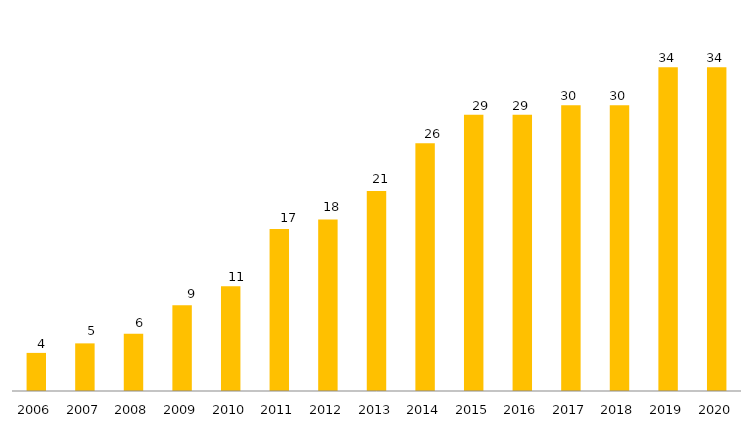
| Category | Pós - Graduação UFGD |
|---|---|
| 2006.0 | 4 |
| 2007.0 | 5 |
| 2008.0 | 6 |
| 2009.0 | 9 |
| 2010.0 | 11 |
| 2011.0 | 17 |
| 2012.0 | 18 |
| 2013.0 | 21 |
| 2014.0 | 26 |
| 2015.0 | 29 |
| 2016.0 | 29 |
| 2017.0 | 30 |
| 2018.0 | 30 |
| 2019.0 | 34 |
| 2020.0 | 34 |